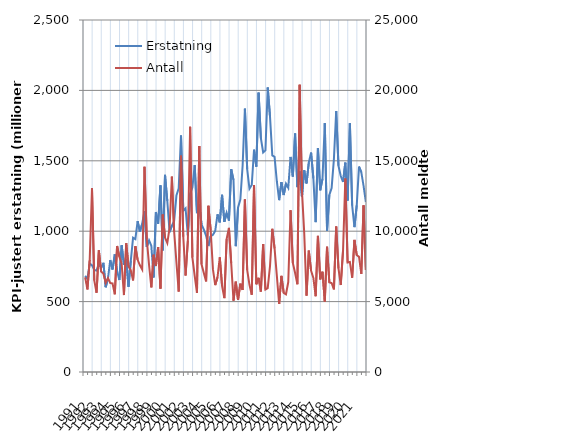
| Category | Erstatning |
|---|---|
| 1991.0 | 682.861 |
| nan | 660.593 |
| nan | 770.781 |
| nan | 757.68 |
| 1992.0 | 724.967 |
| nan | 720.337 |
| nan | 769.124 |
| nan | 738.283 |
| 1993.0 | 775.228 |
| nan | 602.058 |
| nan | 664.256 |
| nan | 794.965 |
| 1994.0 | 727.895 |
| nan | 835.014 |
| nan | 715.669 |
| nan | 653.422 |
| 1995.0 | 900.586 |
| nan | 761.203 |
| nan | 803.181 |
| nan | 605.711 |
| 1996.0 | 789.173 |
| nan | 953.39 |
| nan | 943.881 |
| nan | 1071.001 |
| 1997.0 | 996.152 |
| nan | 1053.434 |
| nan | 1142.066 |
| nan | 887.884 |
| 1998.0 | 935.373 |
| nan | 896.35 |
| nan | 671.783 |
| nan | 1136.193 |
| 1999.0 | 1052.729 |
| nan | 1325.657 |
| nan | 863.644 |
| nan | 1400.154 |
| 2000.0 | 1214.232 |
| nan | 993.707 |
| nan | 1038.895 |
| nan | 1072.169 |
| 2001.0 | 1253.265 |
| nan | 1304.559 |
| nan | 1679.765 |
| nan | 1144.776 |
| 2002.0 | 1162.727 |
| nan | 970.425 |
| nan | 1266.256 |
| nan | 1309.736 |
| 2003.0 | 1469.594 |
| nan | 1128.08 |
| nan | 1190.808 |
| nan | 1048.721 |
| 2004.0 | 1011.439 |
| nan | 967.557 |
| nan | 894.762 |
| nan | 963.959 |
| 2005.0 | 974.405 |
| nan | 1002.461 |
| nan | 1119.883 |
| nan | 1062.719 |
| 2006.0 | 1258.391 |
| nan | 1065.827 |
| nan | 1130.31 |
| nan | 1075.24 |
| 2007.0 | 1439.915 |
| nan | 1364.05 |
| nan | 893.677 |
| nan | 1169.116 |
| 2008.0 | 1224.519 |
| nan | 1465.019 |
| nan | 1870.593 |
| nan | 1441 |
| 2009.0 | 1301.099 |
| nan | 1328.36 |
| nan | 1578.846 |
| nan | 1458.773 |
| 2010.0 | 1984.188 |
| nan | 1660.479 |
| nan | 1559.014 |
| nan | 1574.052 |
| 2011.0 | 2021.055 |
| nan | 1813.246 |
| nan | 1538.78 |
| nan | 1527.545 |
| 2012.0 | 1353.017 |
| nan | 1220.672 |
| nan | 1348.959 |
| nan | 1256.877 |
| 2013.0 | 1337.311 |
| nan | 1307.667 |
| nan | 1527.592 |
| nan | 1388.401 |
| 2014.0 | 1693.847 |
| nan | 1313.108 |
| nan | 1424.554 |
| nan | 1243.361 |
| 2015.0 | 1432.487 |
| nan | 1339.063 |
| nan | 1487.095 |
| nan | 1558.19 |
| 2016.0 | 1375.58 |
| nan | 1064.405 |
| nan | 1591.137 |
| nan | 1290.489 |
| 2017.0 | 1371.785 |
| nan | 1767.479 |
| nan | 1003.271 |
| nan | 1257.841 |
| 2018.0 | 1305.9 |
| nan | 1512.06 |
| nan | 1853.654 |
| nan | 1464.441 |
| 2019.0 | 1391.758 |
| nan | 1349.421 |
| nan | 1486.971 |
| nan | 1218.36 |
| 2020.0 | 1766.411 |
| nan | 1183.175 |
| nan | 1028.942 |
| nan | 1182.948 |
| 2021.0 | 1458.619 |
| nan | 1419.051 |
| nan | 1321.469 |
| nan | 1207.092 |